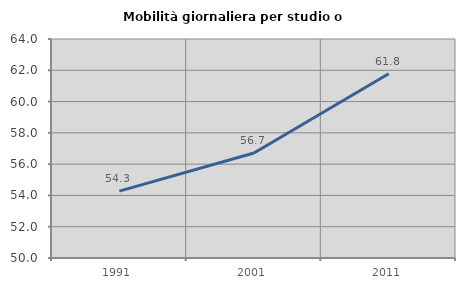
| Category | Mobilità giornaliera per studio o lavoro |
|---|---|
| 1991.0 | 54.274 |
| 2001.0 | 56.713 |
| 2011.0 | 61.774 |